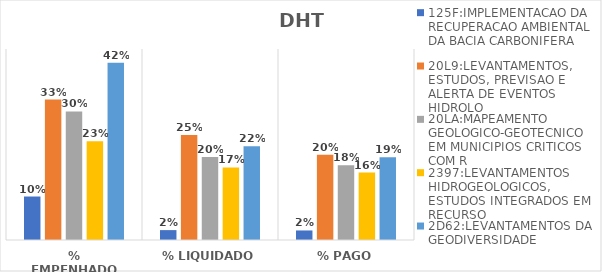
| Category | 125F:IMPLEMENTACAO DA RECUPERACAO AMBIENTAL DA BACIA CARBONIFERA | 20L9:LEVANTAMENTOS, ESTUDOS, PREVISAO E ALERTA DE EVENTOS HIDROLO | 20LA:MAPEAMENTO GEOLOGICO-GEOTECNICO EM MUNICIPIOS CRITICOS COM R | 2397:LEVANTAMENTOS HIDROGEOLOGICOS, ESTUDOS INTEGRADOS EM RECURSO | 2D62:LEVANTAMENTOS DA GEODIVERSIDADE |
|---|---|---|---|---|---|
| % EMPENHADO | 0.102 | 0.331 | 0.303 | 0.233 | 0.418 |
| % LIQUIDADO | 0.023 | 0.247 | 0.196 | 0.171 | 0.221 |
| % PAGO | 0.022 | 0.201 | 0.176 | 0.159 | 0.195 |